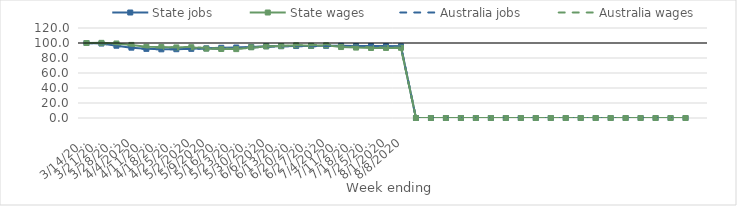
| Category | State jobs | State wages | Australia jobs | Australia wages |
|---|---|---|---|---|
| 14/03/2020 | 100 | 100 | 100 | 100 |
| 21/03/2020 | 99.262 | 100.202 | 99.296 | 99.679 |
| 28/03/2020 | 96.368 | 99.37 | 96.376 | 98.416 |
| 04/04/2020 | 93.789 | 97.443 | 93.719 | 96.743 |
| 11/04/2020 | 92.174 | 94.911 | 91.949 | 94.153 |
| 18/04/2020 | 91.578 | 94.551 | 91.46 | 94.028 |
| 25/04/2020 | 91.722 | 94.088 | 91.774 | 94.242 |
| 02/05/2020 | 92.199 | 94.375 | 92.164 | 94.699 |
| 09/05/2020 | 92.88 | 92.466 | 92.706 | 93.349 |
| 16/05/2020 | 93.594 | 92 | 93.235 | 92.689 |
| 23/05/2020 | 94.018 | 91.836 | 93.534 | 92.291 |
| 30/05/2020 | 94.664 | 94.251 | 94.056 | 93.572 |
| 06/06/2020 | 95.746 | 95.449 | 94.996 | 95.371 |
| 13/06/2020 | 95.756 | 95.835 | 95.462 | 96.012 |
| 20/06/2020 | 95.96 | 96.919 | 95.685 | 96.877 |
| 27/06/2020 | 96.046 | 96.317 | 95.589 | 96.891 |
| 04/07/2020 | 96.241 | 96.88 | 96.048 | 98.279 |
| 11/07/2020 | 96.282 | 94.614 | 96.137 | 95.659 |
| 18/07/2020 | 95.994 | 93.882 | 95.918 | 95.021 |
| 25/07/2020 | 96.04 | 93.349 | 95.887 | 94.374 |
| 01/08/2020 | 95.854 | 93.405 | 95.429 | 94.068 |
| 08/08/2020 | 95.627 | 93.597 | 95.147 | 93.816 |